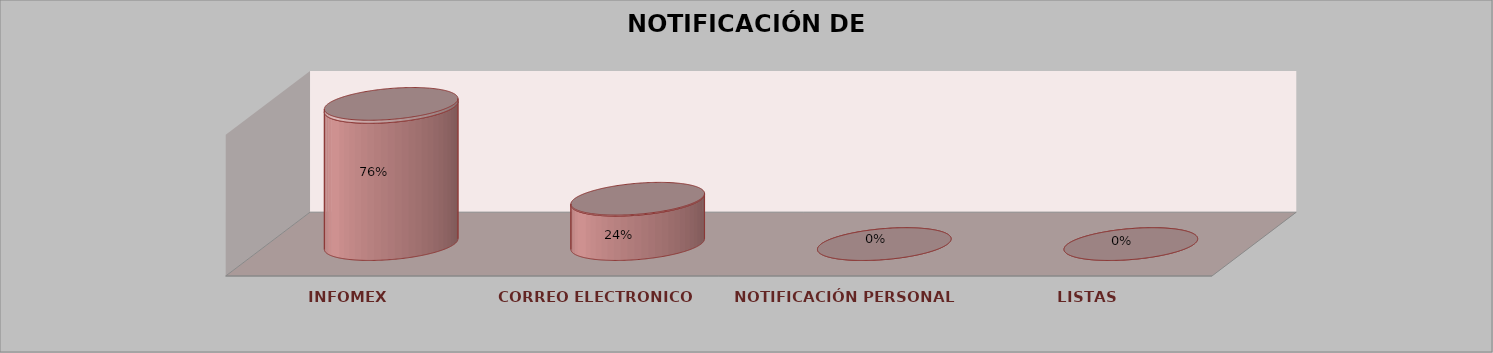
| Category | Series 0 | Series 1 | Series 2 | Series 3 | Series 4 |
|---|---|---|---|---|---|
| INFOMEX |  |  |  | 34 | 0.756 |
| CORREO ELECTRONICO |  |  |  | 11 | 0.244 |
| NOTIFICACIÓN PERSONAL |  |  |  | 0 | 0 |
| LISTAS |  |  |  | 0 | 0 |